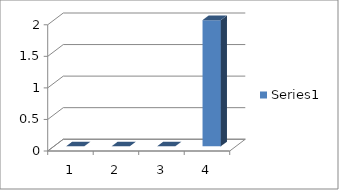
| Category | Series 0 |
|---|---|
| 0 | 0 |
| 1 | 0 |
| 2 | 0 |
| 3 | 2 |